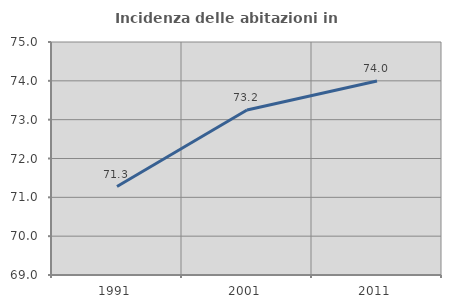
| Category | Incidenza delle abitazioni in proprietà  |
|---|---|
| 1991.0 | 71.279 |
| 2001.0 | 73.249 |
| 2011.0 | 73.995 |